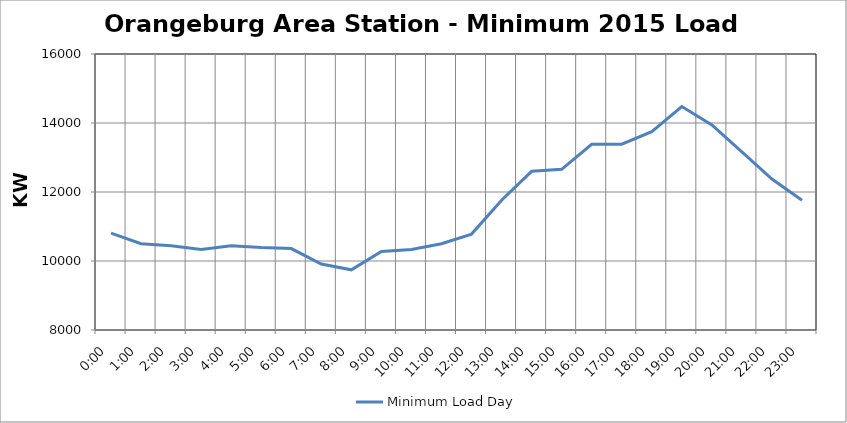
| Category | Minimum Load Day |
|---|---|
| 0.0 | 10808 |
| 0.041666666666666664 | 10500 |
| 0.08333333333333333 | 10444 |
| 0.125 | 10332 |
| 0.16666666666666666 | 10444 |
| 0.20833333333333334 | 10388 |
| 0.25 | 10360 |
| 0.2916666666666667 | 9912 |
| 0.3333333333333333 | 9744 |
| 0.375 | 10276 |
| 0.4166666666666667 | 10332 |
| 0.4583333333333333 | 10500 |
| 0.5 | 10780 |
| 0.5416666666666666 | 11760 |
| 0.5833333333333334 | 12600 |
| 0.625 | 12656 |
| 0.6666666666666666 | 13384 |
| 0.7083333333333334 | 13384 |
| 0.75 | 13748 |
| 0.7916666666666666 | 14476 |
| 0.8333333333333334 | 13944 |
| 0.875 | 13160 |
| 0.9166666666666666 | 12376 |
| 0.9583333333333334 | 11760 |